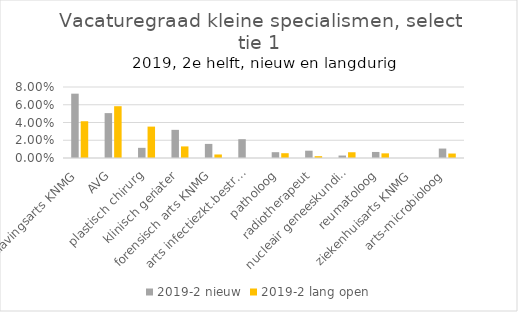
| Category | 2019-2 |
|---|---|
| verslavingsarts KNMG | 0.041 |
| AVG | 0.058 |
| plastisch chirurg | 0.035 |
| klinisch geriater | 0.013 |
| forensisch arts KNMG | 0.004 |
| arts infectiezkt.bestr. KNMG | 0 |
| patholoog | 0.005 |
| radiotherapeut | 0.002 |
| nucleair geneeskundige | 0.006 |
| reumatoloog | 0.005 |
| ziekenhuisarts KNMG | 0 |
| arts-microbioloog | 0.005 |